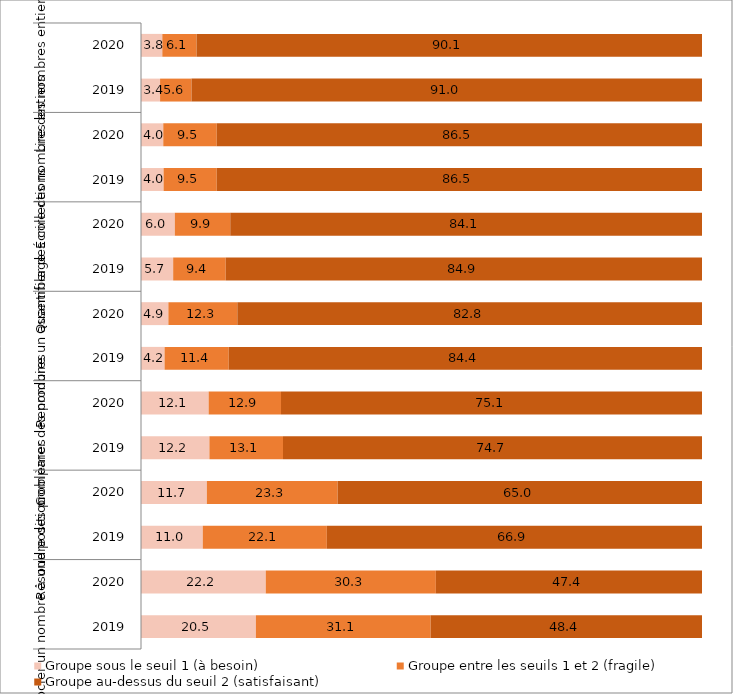
| Category | Groupe sous le seuil 1 (à besoin) | Groupe entre les seuils 1 et 2 (fragile) | Groupe au-dessus du seuil 2 (satisfaisant) |
|---|---|---|---|
| 0 | 20.479 | 31.148 | 48.373 |
| 1 | 22.24 | 30.32 | 47.44 |
| 2 | 11.009 | 22.117 | 66.874 |
| 3 | 11.74 | 23.31 | 64.96 |
| 4 | 12.196 | 13.116 | 74.688 |
| 5 | 12.06 | 12.9 | 75.05 |
| 6 | 4.201 | 11.437 | 84.362 |
| 7 | 4.88 | 12.29 | 82.83 |
| 8 | 5.735 | 9.365 | 84.9 |
| 9 | 6.03 | 9.88 | 84.08 |
| 10 | 4.026 | 9.475 | 86.499 |
| 11 | 3.97 | 9.53 | 86.5 |
| 12 | 3.4 | 5.6 | 91 |
| 13 | 3.8 | 6.1 | 90.1 |